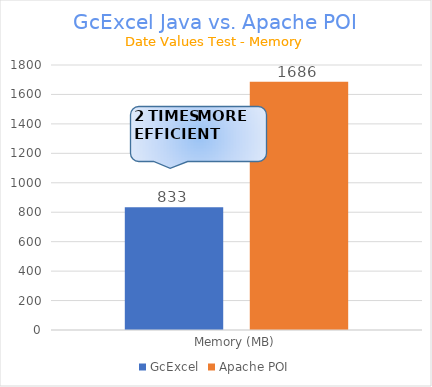
| Category | GcExcel | Apache POI |
|---|---|---|
| Memory (MB) | 833.138 | 1686.236 |